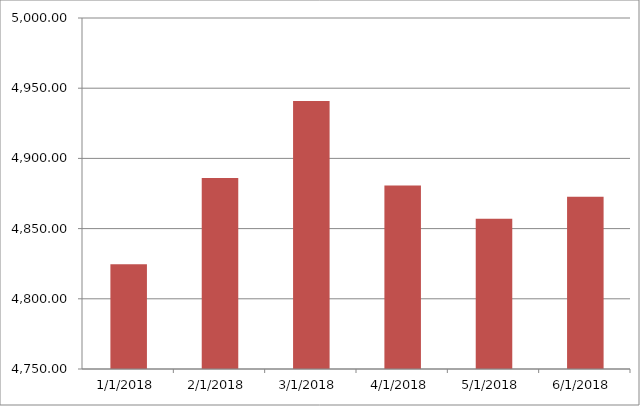
| Category | Series 0 | Series 1 |
|---|---|---|
| 1/1/18 |  | 4824.67 |
| 2/1/18 |  | 4886.02 |
| 3/1/18 |  | 4940.96 |
| 4/1/18 |  | 4880.65 |
| 5/1/18 |  | 4856.99 |
| 6/1/18 |  | 4872.61 |